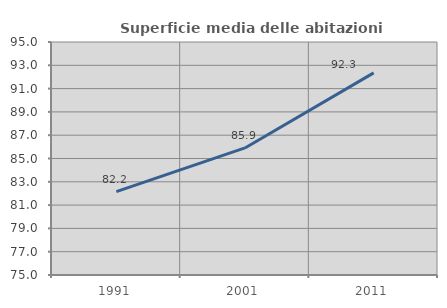
| Category | Superficie media delle abitazioni occupate |
|---|---|
| 1991.0 | 82.153 |
| 2001.0 | 85.906 |
| 2011.0 | 92.348 |